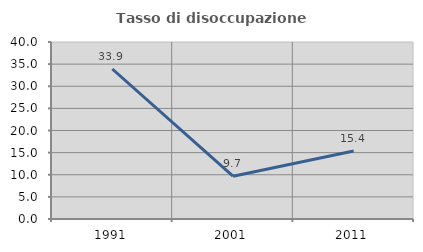
| Category | Tasso di disoccupazione giovanile  |
|---|---|
| 1991.0 | 33.898 |
| 2001.0 | 9.677 |
| 2011.0 | 15.385 |